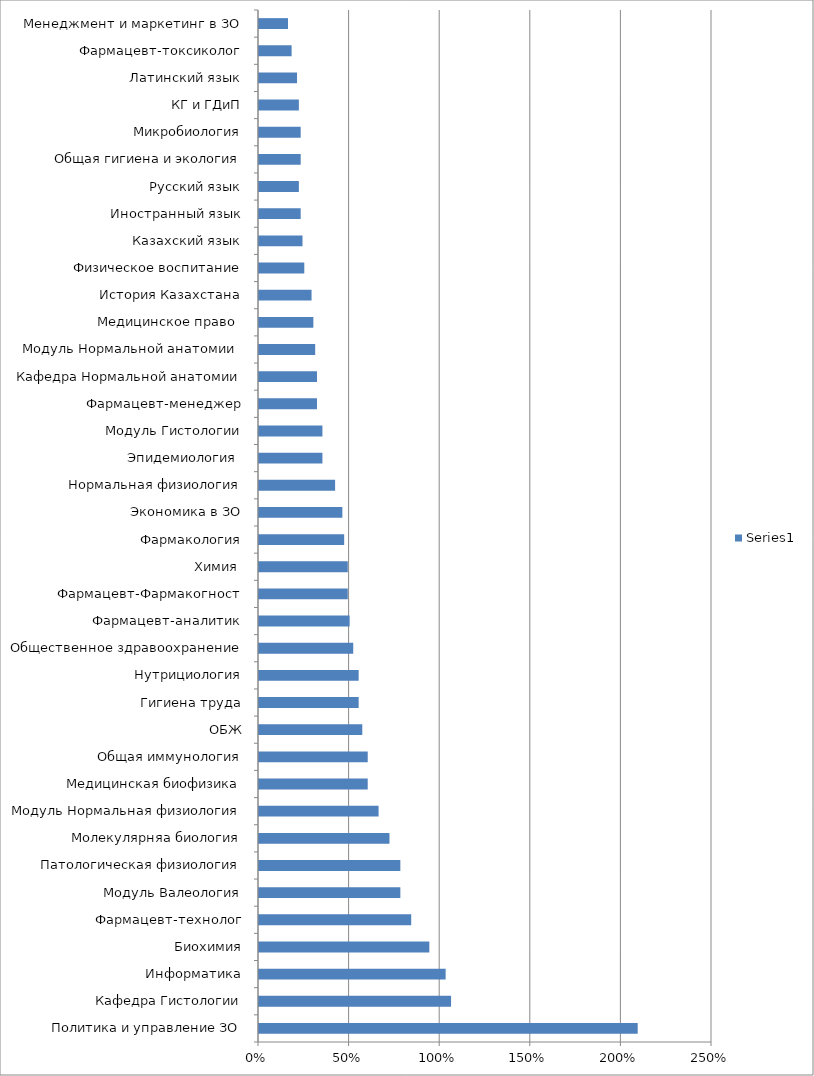
| Category | Series 0 |
|---|---|
| Политика и управление ЗО | 2.09 |
| Кафедра Гистологии | 1.06 |
| Информатика | 1.03 |
| Биохимия | 0.94 |
| Фармацевт-технолог | 0.84 |
| Модуль Валеология | 0.78 |
| Патологическая физиология | 0.78 |
| Молекулярняа биология | 0.72 |
| Модуль Нормальная физиология | 0.66 |
| Медицинская биофизика | 0.6 |
| Общая иммунология | 0.6 |
| ОБЖ | 0.57 |
| Гигиена труда | 0.55 |
| Нутрициология | 0.55 |
| Общественное здравоохранение | 0.52 |
| Фармацевт-аналитик | 0.5 |
| Фармацевт-Фармакогност | 0.49 |
| Химия  | 0.49 |
| Фармакология | 0.47 |
| Экономика в ЗО | 0.46 |
| Нормальная физиология | 0.42 |
| Эпидемиология  | 0.35 |
| Модуль Гистологии | 0.35 |
| Фармацевт-менеджер | 0.32 |
| Кафедра Нормальной анатомии | 0.32 |
| Модуль Нормальной анатомии  | 0.31 |
| Медицинское право  | 0.3 |
| История Казахстана | 0.29 |
| Физическое воспитание | 0.25 |
| Казахский язык | 0.24 |
| Иностранный язык | 0.23 |
| Русский язык | 0.22 |
| Общая гигиена и экология | 0.23 |
| Микробиология | 0.23 |
| КГ и ГДиП | 0.22 |
| Латинский язык | 0.21 |
| Фармацевт-токсиколог | 0.18 |
| Менеджмент и маркетинг в ЗО | 0.16 |